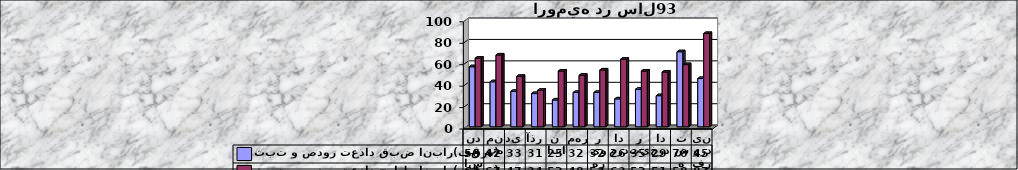
| Category | ثبت و صدور تعداد قبض انبار(فقره) | ثبت و صدور تعداد حواله انبار(فقره) |
|---|---|---|
| اسفند | 56 | 64 |
| بهمن | 42 | 67 |
| دي | 33 | 47 |
| آذر | 31 | 34 |
| آبان  | 25 | 52 |
| مهر | 32 | 48 |
| شهریور | 32 | 53 |
| مرداد | 26 | 63 |
| تير | 35 | 52 |
| خرداد | 29 | 51 |
| ارديبهشت | 70 | 58 |
| فروردين | 45 | 87 |